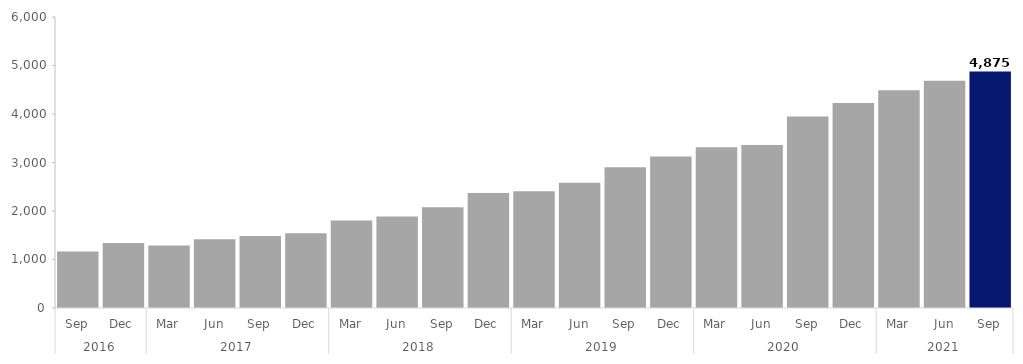
| Category | Series 0 |
|---|---|
| 0 | 1167 |
| 1 | 1338 |
| 2 | 1290 |
| 3 | 1419 |
| 4 | 1482 |
| 5 | 1542 |
| 6 | 1806 |
| 7 | 1887 |
| 8 | 2076 |
| 9 | 2373 |
| 10 | 2406 |
| 11 | 2580 |
| 12 | 2901 |
| 13 | 3126 |
| 14 | 3312 |
| 15 | 3360 |
| 16 | 3948 |
| 17 | 4227 |
| 18 | 4488 |
| 19 | 4686 |
| 20 | 4875 |